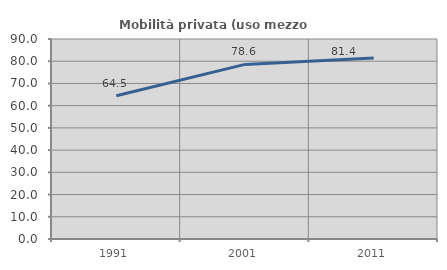
| Category | Mobilità privata (uso mezzo privato) |
|---|---|
| 1991.0 | 64.451 |
| 2001.0 | 78.568 |
| 2011.0 | 81.437 |